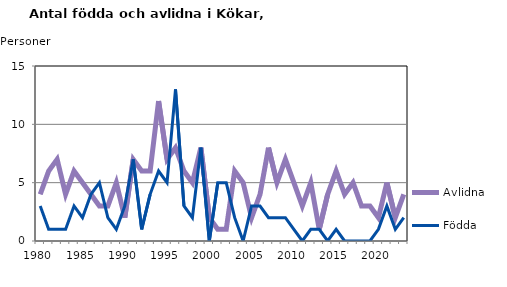
| Category | Avlidna | Födda |
|---|---|---|
| 1980.0 | 4 | 3 |
| 1981.0 | 6 | 1 |
| 1982.0 | 7 | 1 |
| 1983.0 | 4 | 1 |
| 1984.0 | 6 | 3 |
| 1985.0 | 5 | 2 |
| 1986.0 | 4 | 4 |
| 1987.0 | 3 | 5 |
| 1988.0 | 3 | 2 |
| 1989.0 | 5 | 1 |
| 1990.0 | 2 | 3 |
| 1991.0 | 7 | 7 |
| 1992.0 | 6 | 1 |
| 1993.0 | 6 | 4 |
| 1994.0 | 12 | 6 |
| 1995.0 | 7 | 5 |
| 1996.0 | 8 | 13 |
| 1997.0 | 6 | 3 |
| 1998.0 | 5 | 2 |
| 1999.0 | 8 | 8 |
| 2000.0 | 2 | 0 |
| 2001.0 | 1 | 5 |
| 2002.0 | 1 | 5 |
| 2003.0 | 6 | 2 |
| 2004.0 | 5 | 0 |
| 2005.0 | 2 | 3 |
| 2006.0 | 4 | 3 |
| 2007.0 | 8 | 2 |
| 2008.0 | 5 | 2 |
| 2009.0 | 7 | 2 |
| 2010.0 | 5 | 1 |
| 2011.0 | 3 | 0 |
| 2012.0 | 5 | 1 |
| 2013.0 | 1 | 1 |
| 2014.0 | 4 | 0 |
| 2015.0 | 6 | 1 |
| 2016.0 | 4 | 0 |
| 2017.0 | 5 | 0 |
| 2018.0 | 3 | 0 |
| 2019.0 | 3 | 0 |
| 2020.0 | 2 | 1 |
| 2021.0 | 5 | 3 |
| 2022.0 | 2 | 1 |
| 2023.0 | 4 | 2 |